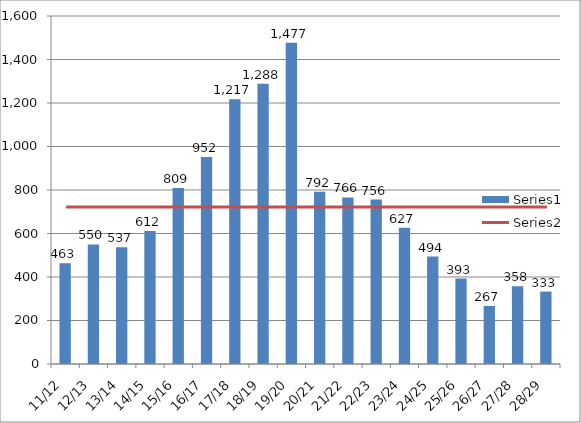
| Category | Series 0 |
|---|---|
| 11/12 | 463 |
| 12/13 | 550 |
| 13/14 | 537 |
| 14/15 | 612 |
| 15/16 | 809 |
| 16/17 | 952 |
| 17/18 | 1217 |
| 18/19 | 1288 |
| 19/20 | 1477 |
| 20/21 | 792 |
| 21/22 | 766 |
| 22/23 | 756 |
| 23/24 | 627 |
| 24/25 | 494 |
| 25/26 | 393 |
| 26/27 | 267 |
| 27/28 | 358 |
| 28/29 | 333 |